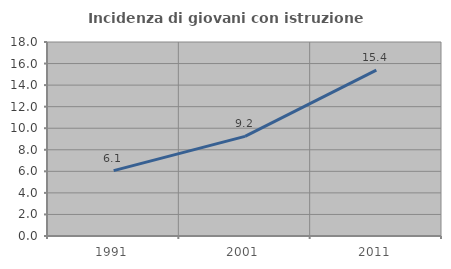
| Category | Incidenza di giovani con istruzione universitaria |
|---|---|
| 1991.0 | 6.069 |
| 2001.0 | 9.246 |
| 2011.0 | 15.392 |